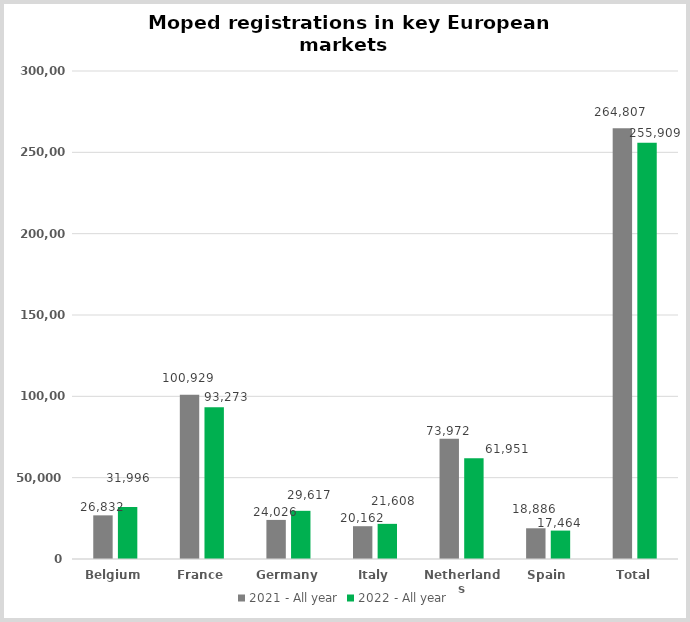
| Category | 2021 - All year | 2022 - All year |
|---|---|---|
| Belgium | 26832 | 31996 |
| France | 100929 | 93273 |
| Germany | 24026 | 29617 |
| Italy | 20162 | 21608 |
| Netherlands | 73972 | 61951 |
| Spain | 18886 | 17464 |
| Total | 264807 | 255909 |